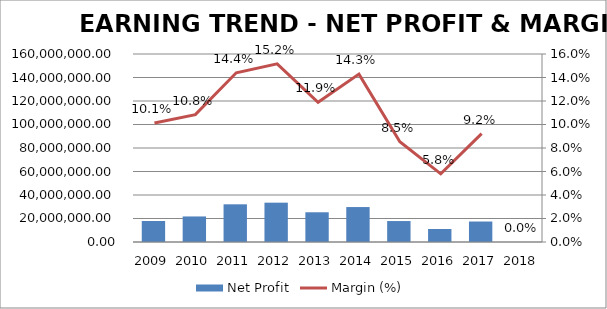
| Category | Net Profit |
|---|---|
| 2009.0 | 17854221 |
| 2010.0 | 21741325 |
| 2011.0 | 32083145 |
| 2012.0 | 33470740 |
| 2013.0 | 25293936 |
| 2014.0 | 29742425 |
| 2015.0 | 17833017 |
| 2016.0 | 11071841 |
| 2017.0 | 17425334 |
| 2018.0 | 0 |